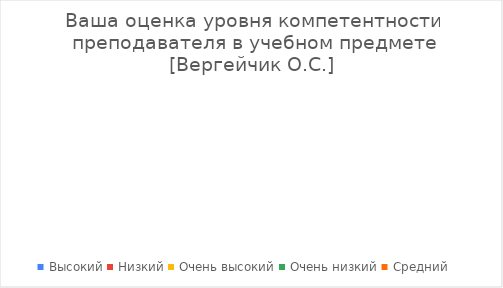
| Category | Series 0 |
|---|---|
| Высокий | 0 |
| Низкий | 0 |
| Очень высокий | 0 |
| Очень низкий | 0 |
| Средний | 0 |